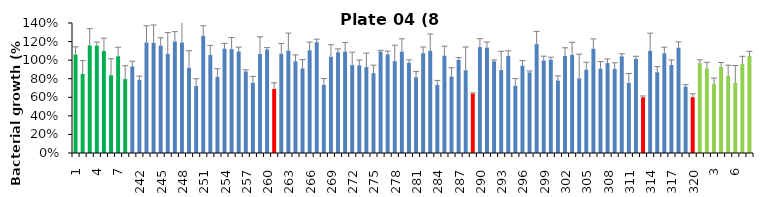
| Category | 8 h % |
|---|---|
| 1.0 | 1.06 |
| 2.0 | 0.85 |
| 3.0 | 1.158 |
| 4.0 | 1.157 |
| 5.0 | 1.099 |
| 6.0 | 0.837 |
| 7.0 | 1.042 |
| 8.0 | 0.796 |
| 241.0 | 0.932 |
| 242.0 | 0.788 |
| 243.0 | 1.19 |
| 244.0 | 1.186 |
| 245.0 | 1.156 |
| 246.0 | 1.066 |
| 247.0 | 1.201 |
| 248.0 | 1.191 |
| 249.0 | 0.915 |
| 250.0 | 0.721 |
| 251.0 | 1.26 |
| 252.0 | 1.056 |
| 253.0 | 0.818 |
| 254.0 | 1.125 |
| 255.0 | 1.118 |
| 256.0 | 1.094 |
| 257.0 | 0.878 |
| 258.0 | 0.755 |
| 259.0 | 1.065 |
| 260.0 | 1.115 |
| 261.0 | 0.69 |
| 262.0 | 1.068 |
| 263.0 | 1.102 |
| 264.0 | 0.986 |
| 265.0 | 0.911 |
| 266.0 | 1.107 |
| 267.0 | 1.193 |
| 268.0 | 0.733 |
| 269.0 | 1.036 |
| 270.0 | 1.085 |
| 271.0 | 1.092 |
| 272.0 | 0.947 |
| 273.0 | 0.944 |
| 274.0 | 0.925 |
| 275.0 | 0.859 |
| 276.0 | 1.093 |
| 277.0 | 1.062 |
| 278.0 | 0.989 |
| 279.0 | 1.092 |
| 280.0 | 0.971 |
| 281.0 | 0.815 |
| 282.0 | 1.074 |
| 283.0 | 1.101 |
| 284.0 | 0.733 |
| 285.0 | 1.048 |
| 286.0 | 0.823 |
| 287.0 | 1.003 |
| 288.0 | 0.89 |
| 289.0 | 0.64 |
| 290.0 | 1.14 |
| 291.0 | 1.135 |
| 292.0 | 0.988 |
| 293.0 | 0.893 |
| 294.0 | 1.047 |
| 295.0 | 0.724 |
| 296.0 | 0.941 |
| 297.0 | 0.868 |
| 298.0 | 1.172 |
| 299.0 | 0.996 |
| 300.0 | 1.005 |
| 301.0 | 0.78 |
| 302.0 | 1.045 |
| 303.0 | 1.055 |
| 304.0 | 0.802 |
| 305.0 | 0.897 |
| 306.0 | 1.122 |
| 307.0 | 0.908 |
| 308.0 | 0.968 |
| 309.0 | 0.905 |
| 310.0 | 1.041 |
| 311.0 | 0.754 |
| 312.0 | 1.015 |
| 313.0 | 0.6 |
| 314.0 | 1.101 |
| 315.0 | 0.87 |
| 316.0 | 1.073 |
| 317.0 | 0.947 |
| 318.0 | 1.134 |
| 319.0 | 0.715 |
| 320.0 | 0.601 |
| 1.0 | 0.968 |
| 2.0 | 0.911 |
| 3.0 | 0.741 |
| 4.0 | 0.928 |
| 5.0 | 0.83 |
| 6.0 | 0.755 |
| 7.0 | 0.96 |
| 8.0 | 1.045 |